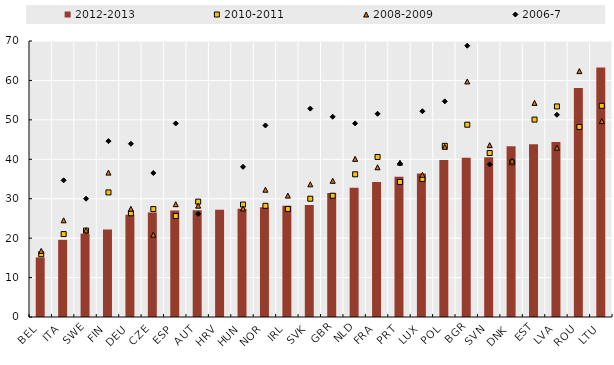
| Category | 2012-2013 |
|---|---|
| BEL | 15.106 |
| ITA | 19.572 |
| SWE | 21.156 |
| FIN | 22.216 |
| DEU | 25.933 |
| CZE | 26.484 |
| ESP | 26.982 |
| AUT | 27.07 |
| HRV | 27.218 |
| HUN | 27.467 |
| NOR | 27.81 |
| IRL | 28.185 |
| SVK | 28.429 |
| GBR | 31.48 |
| NLD | 32.811 |
| FRA | 34.264 |
| PRT | 35.598 |
| LUX | 36.416 |
| POL | 39.844 |
| BGR | 40.36 |
| SVN | 40.515 |
| DNK | 43.337 |
| EST | 43.796 |
| LVA | 44.404 |
| ROU | 58.11 |
| LTU | 63.292 |